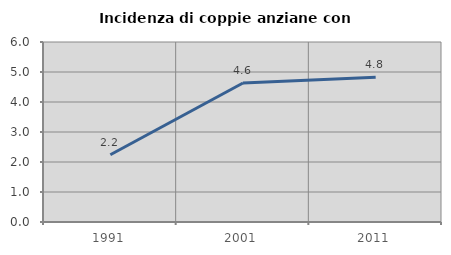
| Category | Incidenza di coppie anziane con figli |
|---|---|
| 1991.0 | 2.241 |
| 2001.0 | 4.634 |
| 2011.0 | 4.821 |